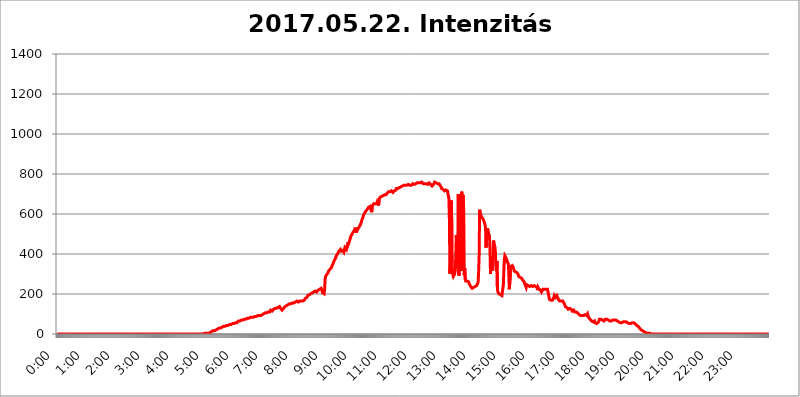
| Category | 2017.05.22. Intenzitás [W/m^2] |
|---|---|
| 0.0 | 0 |
| 0.0006944444444444445 | 0 |
| 0.001388888888888889 | 0 |
| 0.0020833333333333333 | 0 |
| 0.002777777777777778 | 0 |
| 0.003472222222222222 | 0 |
| 0.004166666666666667 | 0 |
| 0.004861111111111111 | 0 |
| 0.005555555555555556 | 0 |
| 0.0062499999999999995 | 0 |
| 0.006944444444444444 | 0 |
| 0.007638888888888889 | 0 |
| 0.008333333333333333 | 0 |
| 0.009027777777777779 | 0 |
| 0.009722222222222222 | 0 |
| 0.010416666666666666 | 0 |
| 0.011111111111111112 | 0 |
| 0.011805555555555555 | 0 |
| 0.012499999999999999 | 0 |
| 0.013194444444444444 | 0 |
| 0.013888888888888888 | 0 |
| 0.014583333333333332 | 0 |
| 0.015277777777777777 | 0 |
| 0.015972222222222224 | 0 |
| 0.016666666666666666 | 0 |
| 0.017361111111111112 | 0 |
| 0.018055555555555557 | 0 |
| 0.01875 | 0 |
| 0.019444444444444445 | 0 |
| 0.02013888888888889 | 0 |
| 0.020833333333333332 | 0 |
| 0.02152777777777778 | 0 |
| 0.022222222222222223 | 0 |
| 0.02291666666666667 | 0 |
| 0.02361111111111111 | 0 |
| 0.024305555555555556 | 0 |
| 0.024999999999999998 | 0 |
| 0.025694444444444447 | 0 |
| 0.02638888888888889 | 0 |
| 0.027083333333333334 | 0 |
| 0.027777777777777776 | 0 |
| 0.02847222222222222 | 0 |
| 0.029166666666666664 | 0 |
| 0.029861111111111113 | 0 |
| 0.030555555555555555 | 0 |
| 0.03125 | 0 |
| 0.03194444444444445 | 0 |
| 0.03263888888888889 | 0 |
| 0.03333333333333333 | 0 |
| 0.034027777777777775 | 0 |
| 0.034722222222222224 | 0 |
| 0.035416666666666666 | 0 |
| 0.036111111111111115 | 0 |
| 0.03680555555555556 | 0 |
| 0.0375 | 0 |
| 0.03819444444444444 | 0 |
| 0.03888888888888889 | 0 |
| 0.03958333333333333 | 0 |
| 0.04027777777777778 | 0 |
| 0.04097222222222222 | 0 |
| 0.041666666666666664 | 0 |
| 0.042361111111111106 | 0 |
| 0.04305555555555556 | 0 |
| 0.043750000000000004 | 0 |
| 0.044444444444444446 | 0 |
| 0.04513888888888889 | 0 |
| 0.04583333333333334 | 0 |
| 0.04652777777777778 | 0 |
| 0.04722222222222222 | 0 |
| 0.04791666666666666 | 0 |
| 0.04861111111111111 | 0 |
| 0.049305555555555554 | 0 |
| 0.049999999999999996 | 0 |
| 0.05069444444444445 | 0 |
| 0.051388888888888894 | 0 |
| 0.052083333333333336 | 0 |
| 0.05277777777777778 | 0 |
| 0.05347222222222222 | 0 |
| 0.05416666666666667 | 0 |
| 0.05486111111111111 | 0 |
| 0.05555555555555555 | 0 |
| 0.05625 | 0 |
| 0.05694444444444444 | 0 |
| 0.057638888888888885 | 0 |
| 0.05833333333333333 | 0 |
| 0.05902777777777778 | 0 |
| 0.059722222222222225 | 0 |
| 0.06041666666666667 | 0 |
| 0.061111111111111116 | 0 |
| 0.06180555555555556 | 0 |
| 0.0625 | 0 |
| 0.06319444444444444 | 0 |
| 0.06388888888888888 | 0 |
| 0.06458333333333334 | 0 |
| 0.06527777777777778 | 0 |
| 0.06597222222222222 | 0 |
| 0.06666666666666667 | 0 |
| 0.06736111111111111 | 0 |
| 0.06805555555555555 | 0 |
| 0.06874999999999999 | 0 |
| 0.06944444444444443 | 0 |
| 0.07013888888888889 | 0 |
| 0.07083333333333333 | 0 |
| 0.07152777777777779 | 0 |
| 0.07222222222222223 | 0 |
| 0.07291666666666667 | 0 |
| 0.07361111111111111 | 0 |
| 0.07430555555555556 | 0 |
| 0.075 | 0 |
| 0.07569444444444444 | 0 |
| 0.0763888888888889 | 0 |
| 0.07708333333333334 | 0 |
| 0.07777777777777778 | 0 |
| 0.07847222222222222 | 0 |
| 0.07916666666666666 | 0 |
| 0.0798611111111111 | 0 |
| 0.08055555555555556 | 0 |
| 0.08125 | 0 |
| 0.08194444444444444 | 0 |
| 0.08263888888888889 | 0 |
| 0.08333333333333333 | 0 |
| 0.08402777777777777 | 0 |
| 0.08472222222222221 | 0 |
| 0.08541666666666665 | 0 |
| 0.08611111111111112 | 0 |
| 0.08680555555555557 | 0 |
| 0.08750000000000001 | 0 |
| 0.08819444444444445 | 0 |
| 0.08888888888888889 | 0 |
| 0.08958333333333333 | 0 |
| 0.09027777777777778 | 0 |
| 0.09097222222222222 | 0 |
| 0.09166666666666667 | 0 |
| 0.09236111111111112 | 0 |
| 0.09305555555555556 | 0 |
| 0.09375 | 0 |
| 0.09444444444444444 | 0 |
| 0.09513888888888888 | 0 |
| 0.09583333333333333 | 0 |
| 0.09652777777777777 | 0 |
| 0.09722222222222222 | 0 |
| 0.09791666666666667 | 0 |
| 0.09861111111111111 | 0 |
| 0.09930555555555555 | 0 |
| 0.09999999999999999 | 0 |
| 0.10069444444444443 | 0 |
| 0.1013888888888889 | 0 |
| 0.10208333333333335 | 0 |
| 0.10277777777777779 | 0 |
| 0.10347222222222223 | 0 |
| 0.10416666666666667 | 0 |
| 0.10486111111111111 | 0 |
| 0.10555555555555556 | 0 |
| 0.10625 | 0 |
| 0.10694444444444444 | 0 |
| 0.1076388888888889 | 0 |
| 0.10833333333333334 | 0 |
| 0.10902777777777778 | 0 |
| 0.10972222222222222 | 0 |
| 0.1111111111111111 | 0 |
| 0.11180555555555556 | 0 |
| 0.11180555555555556 | 0 |
| 0.1125 | 0 |
| 0.11319444444444444 | 0 |
| 0.11388888888888889 | 0 |
| 0.11458333333333333 | 0 |
| 0.11527777777777777 | 0 |
| 0.11597222222222221 | 0 |
| 0.11666666666666665 | 0 |
| 0.1173611111111111 | 0 |
| 0.11805555555555557 | 0 |
| 0.11944444444444445 | 0 |
| 0.12013888888888889 | 0 |
| 0.12083333333333333 | 0 |
| 0.12152777777777778 | 0 |
| 0.12222222222222223 | 0 |
| 0.12291666666666667 | 0 |
| 0.12291666666666667 | 0 |
| 0.12361111111111112 | 0 |
| 0.12430555555555556 | 0 |
| 0.125 | 0 |
| 0.12569444444444444 | 0 |
| 0.12638888888888888 | 0 |
| 0.12708333333333333 | 0 |
| 0.16875 | 0 |
| 0.12847222222222224 | 0 |
| 0.12916666666666668 | 0 |
| 0.12986111111111112 | 0 |
| 0.13055555555555556 | 0 |
| 0.13125 | 0 |
| 0.13194444444444445 | 0 |
| 0.1326388888888889 | 0 |
| 0.13333333333333333 | 0 |
| 0.13402777777777777 | 0 |
| 0.13402777777777777 | 0 |
| 0.13472222222222222 | 0 |
| 0.13541666666666666 | 0 |
| 0.1361111111111111 | 0 |
| 0.13749999999999998 | 0 |
| 0.13819444444444443 | 0 |
| 0.1388888888888889 | 0 |
| 0.13958333333333334 | 0 |
| 0.14027777777777778 | 0 |
| 0.14097222222222222 | 0 |
| 0.14166666666666666 | 0 |
| 0.1423611111111111 | 0 |
| 0.14305555555555557 | 0 |
| 0.14375000000000002 | 0 |
| 0.14444444444444446 | 0 |
| 0.1451388888888889 | 0 |
| 0.1451388888888889 | 0 |
| 0.14652777777777778 | 0 |
| 0.14722222222222223 | 0 |
| 0.14791666666666667 | 0 |
| 0.1486111111111111 | 0 |
| 0.14930555555555555 | 0 |
| 0.15 | 0 |
| 0.15069444444444444 | 0 |
| 0.15138888888888888 | 0 |
| 0.15208333333333332 | 0 |
| 0.15277777777777776 | 0 |
| 0.15347222222222223 | 0 |
| 0.15416666666666667 | 0 |
| 0.15486111111111112 | 0 |
| 0.15555555555555556 | 0 |
| 0.15625 | 0 |
| 0.15694444444444444 | 0 |
| 0.15763888888888888 | 0 |
| 0.15833333333333333 | 0 |
| 0.15902777777777777 | 0 |
| 0.15972222222222224 | 0 |
| 0.16041666666666668 | 0 |
| 0.16111111111111112 | 0 |
| 0.16180555555555556 | 0 |
| 0.1625 | 0 |
| 0.16319444444444445 | 0 |
| 0.1638888888888889 | 0 |
| 0.16458333333333333 | 0 |
| 0.16527777777777777 | 0 |
| 0.16597222222222222 | 0 |
| 0.16666666666666666 | 0 |
| 0.1673611111111111 | 0 |
| 0.16805555555555554 | 0 |
| 0.16874999999999998 | 0 |
| 0.16944444444444443 | 0 |
| 0.17013888888888887 | 0 |
| 0.1708333333333333 | 0 |
| 0.17152777777777775 | 0 |
| 0.17222222222222225 | 0 |
| 0.1729166666666667 | 0 |
| 0.17361111111111113 | 0 |
| 0.17430555555555557 | 0 |
| 0.17500000000000002 | 0 |
| 0.17569444444444446 | 0 |
| 0.1763888888888889 | 0 |
| 0.17708333333333334 | 0 |
| 0.17777777777777778 | 0 |
| 0.17847222222222223 | 0 |
| 0.17916666666666667 | 0 |
| 0.1798611111111111 | 0 |
| 0.18055555555555555 | 0 |
| 0.18125 | 0 |
| 0.18194444444444444 | 0 |
| 0.1826388888888889 | 0 |
| 0.18333333333333335 | 0 |
| 0.1840277777777778 | 0 |
| 0.18472222222222223 | 0 |
| 0.18541666666666667 | 0 |
| 0.18611111111111112 | 0 |
| 0.18680555555555556 | 0 |
| 0.1875 | 0 |
| 0.18819444444444444 | 0 |
| 0.18888888888888888 | 0 |
| 0.18958333333333333 | 0 |
| 0.19027777777777777 | 0 |
| 0.1909722222222222 | 0 |
| 0.19166666666666665 | 0 |
| 0.19236111111111112 | 0 |
| 0.19305555555555554 | 0 |
| 0.19375 | 0 |
| 0.19444444444444445 | 0 |
| 0.1951388888888889 | 0 |
| 0.19583333333333333 | 0 |
| 0.19652777777777777 | 0 |
| 0.19722222222222222 | 0 |
| 0.19791666666666666 | 0 |
| 0.1986111111111111 | 0 |
| 0.19930555555555554 | 0 |
| 0.19999999999999998 | 0 |
| 0.20069444444444443 | 0 |
| 0.20138888888888887 | 0 |
| 0.2020833333333333 | 0 |
| 0.2027777777777778 | 0 |
| 0.2034722222222222 | 0 |
| 0.2041666666666667 | 0 |
| 0.20486111111111113 | 0 |
| 0.20555555555555557 | 3.525 |
| 0.20625000000000002 | 3.525 |
| 0.20694444444444446 | 3.525 |
| 0.2076388888888889 | 3.525 |
| 0.20833333333333334 | 3.525 |
| 0.20902777777777778 | 3.525 |
| 0.20972222222222223 | 3.525 |
| 0.21041666666666667 | 3.525 |
| 0.2111111111111111 | 3.525 |
| 0.21180555555555555 | 3.525 |
| 0.2125 | 3.525 |
| 0.21319444444444444 | 3.525 |
| 0.2138888888888889 | 7.887 |
| 0.21458333333333335 | 7.887 |
| 0.2152777777777778 | 7.887 |
| 0.21597222222222223 | 12.257 |
| 0.21666666666666667 | 12.257 |
| 0.21736111111111112 | 12.257 |
| 0.21805555555555556 | 16.636 |
| 0.21875 | 16.636 |
| 0.21944444444444444 | 16.636 |
| 0.22013888888888888 | 16.636 |
| 0.22083333333333333 | 16.636 |
| 0.22152777777777777 | 16.636 |
| 0.2222222222222222 | 16.636 |
| 0.22291666666666665 | 21.024 |
| 0.2236111111111111 | 21.024 |
| 0.22430555555555556 | 21.024 |
| 0.225 | 25.419 |
| 0.22569444444444445 | 25.419 |
| 0.2263888888888889 | 25.419 |
| 0.22708333333333333 | 29.823 |
| 0.22777777777777777 | 29.823 |
| 0.22847222222222222 | 29.823 |
| 0.22916666666666666 | 29.823 |
| 0.2298611111111111 | 29.823 |
| 0.23055555555555554 | 34.234 |
| 0.23124999999999998 | 34.234 |
| 0.23194444444444443 | 34.234 |
| 0.23263888888888887 | 38.653 |
| 0.2333333333333333 | 38.653 |
| 0.2340277777777778 | 38.653 |
| 0.2347222222222222 | 38.653 |
| 0.2354166666666667 | 38.653 |
| 0.23611111111111113 | 38.653 |
| 0.23680555555555557 | 43.079 |
| 0.23750000000000002 | 43.079 |
| 0.23819444444444446 | 43.079 |
| 0.2388888888888889 | 43.079 |
| 0.23958333333333334 | 43.079 |
| 0.24027777777777778 | 47.511 |
| 0.24097222222222223 | 47.511 |
| 0.24166666666666667 | 47.511 |
| 0.2423611111111111 | 47.511 |
| 0.24305555555555555 | 47.511 |
| 0.24375 | 47.511 |
| 0.24444444444444446 | 47.511 |
| 0.24513888888888888 | 47.511 |
| 0.24583333333333335 | 51.951 |
| 0.2465277777777778 | 51.951 |
| 0.24722222222222223 | 51.951 |
| 0.24791666666666667 | 51.951 |
| 0.24861111111111112 | 56.398 |
| 0.24930555555555556 | 56.398 |
| 0.25 | 56.398 |
| 0.25069444444444444 | 56.398 |
| 0.2513888888888889 | 56.398 |
| 0.2520833333333333 | 56.398 |
| 0.25277777777777777 | 60.85 |
| 0.2534722222222222 | 60.85 |
| 0.25416666666666665 | 65.31 |
| 0.2548611111111111 | 65.31 |
| 0.2555555555555556 | 65.31 |
| 0.25625000000000003 | 65.31 |
| 0.2569444444444445 | 65.31 |
| 0.2576388888888889 | 65.31 |
| 0.25833333333333336 | 69.775 |
| 0.2590277777777778 | 69.775 |
| 0.25972222222222224 | 69.775 |
| 0.2604166666666667 | 69.775 |
| 0.2611111111111111 | 69.775 |
| 0.26180555555555557 | 69.775 |
| 0.2625 | 74.246 |
| 0.26319444444444445 | 74.246 |
| 0.2638888888888889 | 74.246 |
| 0.26458333333333334 | 74.246 |
| 0.2652777777777778 | 78.722 |
| 0.2659722222222222 | 78.722 |
| 0.26666666666666666 | 78.722 |
| 0.2673611111111111 | 78.722 |
| 0.26805555555555555 | 78.722 |
| 0.26875 | 78.722 |
| 0.26944444444444443 | 83.205 |
| 0.2701388888888889 | 83.205 |
| 0.2708333333333333 | 83.205 |
| 0.27152777777777776 | 83.205 |
| 0.2722222222222222 | 83.205 |
| 0.27291666666666664 | 83.205 |
| 0.2736111111111111 | 83.205 |
| 0.2743055555555555 | 83.205 |
| 0.27499999999999997 | 83.205 |
| 0.27569444444444446 | 87.692 |
| 0.27638888888888885 | 87.692 |
| 0.27708333333333335 | 87.692 |
| 0.2777777777777778 | 87.692 |
| 0.27847222222222223 | 92.184 |
| 0.2791666666666667 | 87.692 |
| 0.2798611111111111 | 92.184 |
| 0.28055555555555556 | 92.184 |
| 0.28125 | 92.184 |
| 0.28194444444444444 | 92.184 |
| 0.2826388888888889 | 92.184 |
| 0.2833333333333333 | 92.184 |
| 0.28402777777777777 | 92.184 |
| 0.2847222222222222 | 92.184 |
| 0.28541666666666665 | 92.184 |
| 0.28611111111111115 | 96.682 |
| 0.28680555555555554 | 96.682 |
| 0.28750000000000003 | 96.682 |
| 0.2881944444444445 | 101.184 |
| 0.2888888888888889 | 101.184 |
| 0.28958333333333336 | 101.184 |
| 0.2902777777777778 | 105.69 |
| 0.29097222222222224 | 105.69 |
| 0.2916666666666667 | 105.69 |
| 0.2923611111111111 | 105.69 |
| 0.29305555555555557 | 105.69 |
| 0.29375 | 105.69 |
| 0.29444444444444445 | 105.69 |
| 0.2951388888888889 | 110.201 |
| 0.29583333333333334 | 110.201 |
| 0.2965277777777778 | 110.201 |
| 0.2972222222222222 | 114.716 |
| 0.29791666666666666 | 110.201 |
| 0.2986111111111111 | 114.716 |
| 0.29930555555555555 | 119.235 |
| 0.3 | 119.235 |
| 0.30069444444444443 | 114.716 |
| 0.3013888888888889 | 114.716 |
| 0.3020833333333333 | 119.235 |
| 0.30277777777777776 | 119.235 |
| 0.3034722222222222 | 123.758 |
| 0.30416666666666664 | 123.758 |
| 0.3048611111111111 | 128.284 |
| 0.3055555555555555 | 128.284 |
| 0.30624999999999997 | 128.284 |
| 0.3069444444444444 | 128.284 |
| 0.3076388888888889 | 128.284 |
| 0.30833333333333335 | 128.284 |
| 0.3090277777777778 | 132.814 |
| 0.30972222222222223 | 132.814 |
| 0.3104166666666667 | 132.814 |
| 0.3111111111111111 | 132.814 |
| 0.31180555555555556 | 137.347 |
| 0.3125 | 132.814 |
| 0.31319444444444444 | 128.284 |
| 0.3138888888888889 | 128.284 |
| 0.3145833333333333 | 128.284 |
| 0.31527777777777777 | 119.235 |
| 0.3159722222222222 | 123.758 |
| 0.31666666666666665 | 123.758 |
| 0.31736111111111115 | 128.284 |
| 0.31805555555555554 | 128.284 |
| 0.31875000000000003 | 132.814 |
| 0.3194444444444445 | 137.347 |
| 0.3201388888888889 | 137.347 |
| 0.32083333333333336 | 137.347 |
| 0.3215277777777778 | 141.884 |
| 0.32222222222222224 | 141.884 |
| 0.3229166666666667 | 141.884 |
| 0.3236111111111111 | 146.423 |
| 0.32430555555555557 | 146.423 |
| 0.325 | 150.964 |
| 0.32569444444444445 | 150.964 |
| 0.3263888888888889 | 146.423 |
| 0.32708333333333334 | 150.964 |
| 0.3277777777777778 | 150.964 |
| 0.3284722222222222 | 150.964 |
| 0.32916666666666666 | 155.509 |
| 0.3298611111111111 | 155.509 |
| 0.33055555555555555 | 155.509 |
| 0.33125 | 155.509 |
| 0.33194444444444443 | 155.509 |
| 0.3326388888888889 | 160.056 |
| 0.3333333333333333 | 155.509 |
| 0.3340277777777778 | 160.056 |
| 0.3347222222222222 | 160.056 |
| 0.3354166666666667 | 164.605 |
| 0.3361111111111111 | 164.605 |
| 0.3368055555555556 | 164.605 |
| 0.33749999999999997 | 164.605 |
| 0.33819444444444446 | 160.056 |
| 0.33888888888888885 | 164.605 |
| 0.33958333333333335 | 164.605 |
| 0.34027777777777773 | 164.605 |
| 0.34097222222222223 | 164.605 |
| 0.3416666666666666 | 164.605 |
| 0.3423611111111111 | 164.605 |
| 0.3430555555555555 | 164.605 |
| 0.34375 | 164.605 |
| 0.3444444444444445 | 164.605 |
| 0.3451388888888889 | 164.605 |
| 0.3458333333333334 | 164.605 |
| 0.34652777777777777 | 169.156 |
| 0.34722222222222227 | 173.709 |
| 0.34791666666666665 | 178.264 |
| 0.34861111111111115 | 178.264 |
| 0.34930555555555554 | 182.82 |
| 0.35000000000000003 | 182.82 |
| 0.3506944444444444 | 187.378 |
| 0.3513888888888889 | 191.937 |
| 0.3520833333333333 | 196.497 |
| 0.3527777777777778 | 196.497 |
| 0.3534722222222222 | 196.497 |
| 0.3541666666666667 | 201.058 |
| 0.3548611111111111 | 201.058 |
| 0.35555555555555557 | 201.058 |
| 0.35625 | 205.62 |
| 0.35694444444444445 | 205.62 |
| 0.3576388888888889 | 205.62 |
| 0.35833333333333334 | 210.182 |
| 0.3590277777777778 | 210.182 |
| 0.3597222222222222 | 210.182 |
| 0.36041666666666666 | 210.182 |
| 0.3611111111111111 | 210.182 |
| 0.36180555555555555 | 214.746 |
| 0.3625 | 210.182 |
| 0.36319444444444443 | 210.182 |
| 0.3638888888888889 | 210.182 |
| 0.3645833333333333 | 210.182 |
| 0.3652777777777778 | 214.746 |
| 0.3659722222222222 | 219.309 |
| 0.3666666666666667 | 219.309 |
| 0.3673611111111111 | 219.309 |
| 0.3680555555555556 | 223.873 |
| 0.36874999999999997 | 223.873 |
| 0.36944444444444446 | 228.436 |
| 0.37013888888888885 | 228.436 |
| 0.37083333333333335 | 223.873 |
| 0.37152777777777773 | 214.746 |
| 0.37222222222222223 | 205.62 |
| 0.3729166666666666 | 205.62 |
| 0.3736111111111111 | 201.058 |
| 0.3743055555555555 | 201.058 |
| 0.375 | 223.873 |
| 0.3756944444444445 | 274.047 |
| 0.3763888888888889 | 287.709 |
| 0.3770833333333334 | 292.259 |
| 0.37777777777777777 | 296.808 |
| 0.37847222222222227 | 296.808 |
| 0.37916666666666665 | 301.354 |
| 0.37986111111111115 | 305.898 |
| 0.38055555555555554 | 314.98 |
| 0.38125000000000003 | 314.98 |
| 0.3819444444444444 | 319.517 |
| 0.3826388888888889 | 324.052 |
| 0.3833333333333333 | 328.584 |
| 0.3840277777777778 | 328.584 |
| 0.3847222222222222 | 333.113 |
| 0.3854166666666667 | 342.162 |
| 0.3861111111111111 | 346.682 |
| 0.38680555555555557 | 351.198 |
| 0.3875 | 355.712 |
| 0.38819444444444445 | 364.728 |
| 0.3888888888888889 | 369.23 |
| 0.38958333333333334 | 373.729 |
| 0.3902777777777778 | 378.224 |
| 0.3909722222222222 | 387.202 |
| 0.39166666666666666 | 391.685 |
| 0.3923611111111111 | 396.164 |
| 0.39305555555555555 | 400.638 |
| 0.39375 | 405.108 |
| 0.39444444444444443 | 409.574 |
| 0.3951388888888889 | 414.035 |
| 0.3958333333333333 | 414.035 |
| 0.3965277777777778 | 418.492 |
| 0.3972222222222222 | 422.943 |
| 0.3979166666666667 | 422.943 |
| 0.3986111111111111 | 414.035 |
| 0.3993055555555556 | 414.035 |
| 0.39999999999999997 | 414.035 |
| 0.40069444444444446 | 418.492 |
| 0.40138888888888885 | 418.492 |
| 0.40208333333333335 | 409.574 |
| 0.40277777777777773 | 418.492 |
| 0.40347222222222223 | 431.833 |
| 0.4041666666666666 | 431.833 |
| 0.4048611111111111 | 427.39 |
| 0.4055555555555555 | 422.943 |
| 0.40625 | 436.27 |
| 0.4069444444444445 | 445.129 |
| 0.4076388888888889 | 458.38 |
| 0.4083333333333334 | 449.551 |
| 0.40902777777777777 | 445.129 |
| 0.40972222222222227 | 462.786 |
| 0.41041666666666665 | 471.582 |
| 0.41111111111111115 | 480.356 |
| 0.41180555555555554 | 489.108 |
| 0.41250000000000003 | 493.475 |
| 0.4131944444444444 | 497.836 |
| 0.4138888888888889 | 502.192 |
| 0.4145833333333333 | 506.542 |
| 0.4152777777777778 | 510.885 |
| 0.4159722222222222 | 515.223 |
| 0.4166666666666667 | 519.555 |
| 0.4173611111111111 | 523.88 |
| 0.41805555555555557 | 532.513 |
| 0.41875 | 532.513 |
| 0.41944444444444445 | 506.542 |
| 0.4201388888888889 | 515.223 |
| 0.42083333333333334 | 519.555 |
| 0.4215277777777778 | 523.88 |
| 0.4222222222222222 | 528.2 |
| 0.42291666666666666 | 532.513 |
| 0.4236111111111111 | 536.82 |
| 0.42430555555555555 | 536.82 |
| 0.425 | 545.416 |
| 0.42569444444444443 | 549.704 |
| 0.4263888888888889 | 558.261 |
| 0.4270833333333333 | 566.793 |
| 0.4277777777777778 | 575.299 |
| 0.4284722222222222 | 579.542 |
| 0.4291666666666667 | 588.009 |
| 0.4298611111111111 | 596.45 |
| 0.4305555555555556 | 600.661 |
| 0.43124999999999997 | 604.864 |
| 0.43194444444444446 | 609.062 |
| 0.43263888888888885 | 609.062 |
| 0.43333333333333335 | 617.436 |
| 0.43402777777777773 | 621.613 |
| 0.43472222222222223 | 621.613 |
| 0.4354166666666666 | 625.784 |
| 0.4361111111111111 | 625.784 |
| 0.4368055555555555 | 634.105 |
| 0.4375 | 634.105 |
| 0.4381944444444445 | 634.105 |
| 0.4388888888888889 | 638.256 |
| 0.4395833333333334 | 634.105 |
| 0.44027777777777777 | 617.436 |
| 0.44097222222222227 | 609.062 |
| 0.44166666666666665 | 634.105 |
| 0.44236111111111115 | 642.4 |
| 0.44305555555555554 | 646.537 |
| 0.44375000000000003 | 650.667 |
| 0.4444444444444444 | 646.537 |
| 0.4451388888888889 | 646.537 |
| 0.4458333333333333 | 650.667 |
| 0.4465277777777778 | 650.667 |
| 0.4472222222222222 | 650.667 |
| 0.4479166666666667 | 650.667 |
| 0.4486111111111111 | 658.909 |
| 0.44930555555555557 | 658.909 |
| 0.45 | 663.019 |
| 0.45069444444444445 | 642.4 |
| 0.4513888888888889 | 675.311 |
| 0.45208333333333334 | 679.395 |
| 0.4527777777777778 | 683.473 |
| 0.4534722222222222 | 683.473 |
| 0.45416666666666666 | 687.544 |
| 0.4548611111111111 | 687.544 |
| 0.45555555555555555 | 687.544 |
| 0.45625 | 687.544 |
| 0.45694444444444443 | 691.608 |
| 0.4576388888888889 | 691.608 |
| 0.4583333333333333 | 691.608 |
| 0.4590277777777778 | 695.666 |
| 0.4597222222222222 | 691.608 |
| 0.4604166666666667 | 691.608 |
| 0.4611111111111111 | 695.666 |
| 0.4618055555555556 | 699.717 |
| 0.46249999999999997 | 703.762 |
| 0.46319444444444446 | 703.762 |
| 0.46388888888888885 | 707.8 |
| 0.46458333333333335 | 711.832 |
| 0.46527777777777773 | 707.8 |
| 0.46597222222222223 | 711.832 |
| 0.4666666666666666 | 711.832 |
| 0.4673611111111111 | 715.858 |
| 0.4680555555555555 | 711.832 |
| 0.46875 | 715.858 |
| 0.4694444444444445 | 715.858 |
| 0.4701388888888889 | 711.832 |
| 0.4708333333333334 | 707.8 |
| 0.47152777777777777 | 711.832 |
| 0.47222222222222227 | 707.8 |
| 0.47291666666666665 | 715.858 |
| 0.47361111111111115 | 711.832 |
| 0.47430555555555554 | 719.877 |
| 0.47500000000000003 | 719.877 |
| 0.4756944444444444 | 727.896 |
| 0.4763888888888889 | 727.896 |
| 0.4770833333333333 | 727.896 |
| 0.4777777777777778 | 727.896 |
| 0.4784722222222222 | 731.896 |
| 0.4791666666666667 | 727.896 |
| 0.4798611111111111 | 731.896 |
| 0.48055555555555557 | 727.896 |
| 0.48125 | 731.896 |
| 0.48194444444444445 | 735.89 |
| 0.4826388888888889 | 739.877 |
| 0.48333333333333334 | 735.89 |
| 0.4840277777777778 | 739.877 |
| 0.4847222222222222 | 739.877 |
| 0.48541666666666666 | 739.877 |
| 0.4861111111111111 | 743.859 |
| 0.48680555555555555 | 743.859 |
| 0.4875 | 743.859 |
| 0.48819444444444443 | 743.859 |
| 0.4888888888888889 | 743.859 |
| 0.4895833333333333 | 743.859 |
| 0.4902777777777778 | 743.859 |
| 0.4909722222222222 | 743.859 |
| 0.4916666666666667 | 743.859 |
| 0.4923611111111111 | 747.834 |
| 0.4930555555555556 | 747.834 |
| 0.49374999999999997 | 743.859 |
| 0.49444444444444446 | 743.859 |
| 0.49513888888888885 | 743.859 |
| 0.49583333333333335 | 743.859 |
| 0.49652777777777773 | 743.859 |
| 0.49722222222222223 | 743.859 |
| 0.4979166666666666 | 747.834 |
| 0.4986111111111111 | 751.803 |
| 0.4993055555555555 | 751.803 |
| 0.5 | 751.803 |
| 0.5006944444444444 | 747.834 |
| 0.5013888888888889 | 747.834 |
| 0.5020833333333333 | 751.803 |
| 0.5027777777777778 | 751.803 |
| 0.5034722222222222 | 755.766 |
| 0.5041666666666667 | 755.766 |
| 0.5048611111111111 | 755.766 |
| 0.5055555555555555 | 759.723 |
| 0.50625 | 755.766 |
| 0.5069444444444444 | 755.766 |
| 0.5076388888888889 | 755.766 |
| 0.5083333333333333 | 759.723 |
| 0.5090277777777777 | 755.766 |
| 0.5097222222222222 | 759.723 |
| 0.5104166666666666 | 759.723 |
| 0.5111111111111112 | 759.723 |
| 0.5118055555555555 | 759.723 |
| 0.5125000000000001 | 759.723 |
| 0.5131944444444444 | 751.803 |
| 0.513888888888889 | 747.834 |
| 0.5145833333333333 | 751.803 |
| 0.5152777777777778 | 751.803 |
| 0.5159722222222222 | 755.766 |
| 0.5166666666666667 | 751.803 |
| 0.517361111111111 | 751.803 |
| 0.5180555555555556 | 751.803 |
| 0.5187499999999999 | 747.834 |
| 0.5194444444444445 | 747.834 |
| 0.5201388888888888 | 751.803 |
| 0.5208333333333334 | 751.803 |
| 0.5215277777777778 | 755.766 |
| 0.5222222222222223 | 751.803 |
| 0.5229166666666667 | 751.803 |
| 0.5236111111111111 | 747.834 |
| 0.5243055555555556 | 743.859 |
| 0.525 | 743.859 |
| 0.5256944444444445 | 739.877 |
| 0.5263888888888889 | 739.877 |
| 0.5270833333333333 | 743.859 |
| 0.5277777777777778 | 747.834 |
| 0.5284722222222222 | 751.803 |
| 0.5291666666666667 | 759.723 |
| 0.5298611111111111 | 755.766 |
| 0.5305555555555556 | 759.723 |
| 0.53125 | 755.766 |
| 0.5319444444444444 | 755.766 |
| 0.5326388888888889 | 751.803 |
| 0.5333333333333333 | 751.803 |
| 0.5340277777777778 | 747.834 |
| 0.5347222222222222 | 747.834 |
| 0.5354166666666667 | 751.803 |
| 0.5361111111111111 | 751.803 |
| 0.5368055555555555 | 743.859 |
| 0.5375 | 739.877 |
| 0.5381944444444444 | 735.89 |
| 0.5388888888888889 | 727.896 |
| 0.5395833333333333 | 723.889 |
| 0.5402777777777777 | 727.896 |
| 0.5409722222222222 | 723.889 |
| 0.5416666666666666 | 723.889 |
| 0.5423611111111112 | 719.877 |
| 0.5430555555555555 | 715.858 |
| 0.5437500000000001 | 711.832 |
| 0.5444444444444444 | 711.832 |
| 0.545138888888889 | 719.877 |
| 0.5458333333333333 | 723.889 |
| 0.5465277777777778 | 719.877 |
| 0.5472222222222222 | 715.858 |
| 0.5479166666666667 | 715.858 |
| 0.548611111111111 | 711.832 |
| 0.5493055555555556 | 675.311 |
| 0.5499999999999999 | 575.299 |
| 0.5506944444444445 | 301.354 |
| 0.5513888888888888 | 342.162 |
| 0.5520833333333334 | 405.108 |
| 0.5527777777777778 | 667.123 |
| 0.5534722222222223 | 489.108 |
| 0.5541666666666667 | 314.98 |
| 0.5548611111111111 | 296.808 |
| 0.5555555555555556 | 287.709 |
| 0.55625 | 287.709 |
| 0.5569444444444445 | 296.808 |
| 0.5576388888888889 | 305.898 |
| 0.5583333333333333 | 319.517 |
| 0.5590277777777778 | 324.052 |
| 0.5597222222222222 | 493.475 |
| 0.5604166666666667 | 396.164 |
| 0.5611111111111111 | 355.712 |
| 0.5618055555555556 | 422.943 |
| 0.5625 | 699.717 |
| 0.5631944444444444 | 292.259 |
| 0.5638888888888889 | 301.354 |
| 0.5645833333333333 | 382.715 |
| 0.5652777777777778 | 592.233 |
| 0.5659722222222222 | 553.986 |
| 0.5666666666666667 | 667.123 |
| 0.5673611111111111 | 711.832 |
| 0.5680555555555555 | 314.98 |
| 0.56875 | 695.666 |
| 0.5694444444444444 | 687.544 |
| 0.5701388888888889 | 609.062 |
| 0.5708333333333333 | 296.808 |
| 0.5715277777777777 | 328.584 |
| 0.5722222222222222 | 274.047 |
| 0.5729166666666666 | 264.932 |
| 0.5736111111111112 | 264.932 |
| 0.5743055555555555 | 264.932 |
| 0.5750000000000001 | 264.932 |
| 0.5756944444444444 | 260.373 |
| 0.576388888888889 | 260.373 |
| 0.5770833333333333 | 260.373 |
| 0.5777777777777778 | 251.251 |
| 0.5784722222222222 | 251.251 |
| 0.5791666666666667 | 246.689 |
| 0.579861111111111 | 237.564 |
| 0.5805555555555556 | 233 |
| 0.5812499999999999 | 233 |
| 0.5819444444444445 | 228.436 |
| 0.5826388888888888 | 233 |
| 0.5833333333333334 | 233 |
| 0.5840277777777778 | 233 |
| 0.5847222222222223 | 233 |
| 0.5854166666666667 | 233 |
| 0.5861111111111111 | 237.564 |
| 0.5868055555555556 | 242.127 |
| 0.5875 | 242.127 |
| 0.5881944444444445 | 242.127 |
| 0.5888888888888889 | 246.689 |
| 0.5895833333333333 | 251.251 |
| 0.5902777777777778 | 260.373 |
| 0.5909722222222222 | 310.44 |
| 0.5916666666666667 | 382.715 |
| 0.5923611111111111 | 621.613 |
| 0.5930555555555556 | 609.062 |
| 0.59375 | 600.661 |
| 0.5944444444444444 | 592.233 |
| 0.5951388888888889 | 583.779 |
| 0.5958333333333333 | 579.542 |
| 0.5965277777777778 | 583.779 |
| 0.5972222222222222 | 575.299 |
| 0.5979166666666667 | 571.049 |
| 0.5986111111111111 | 562.53 |
| 0.5993055555555555 | 558.261 |
| 0.6 | 545.416 |
| 0.6006944444444444 | 532.513 |
| 0.6013888888888889 | 431.833 |
| 0.6020833333333333 | 489.108 |
| 0.6027777777777777 | 480.356 |
| 0.6034722222222222 | 528.2 |
| 0.6041666666666666 | 515.223 |
| 0.6048611111111112 | 510.885 |
| 0.6055555555555555 | 510.885 |
| 0.6062500000000001 | 489.108 |
| 0.6069444444444444 | 418.492 |
| 0.607638888888889 | 301.354 |
| 0.6083333333333333 | 364.728 |
| 0.6090277777777778 | 387.202 |
| 0.6097222222222222 | 314.98 |
| 0.6104166666666667 | 310.44 |
| 0.611111111111111 | 387.202 |
| 0.6118055555555556 | 467.187 |
| 0.6124999999999999 | 458.38 |
| 0.6131944444444445 | 445.129 |
| 0.6138888888888888 | 436.27 |
| 0.6145833333333334 | 405.108 |
| 0.6152777777777778 | 328.584 |
| 0.6159722222222223 | 314.98 |
| 0.6166666666666667 | 364.728 |
| 0.6173611111111111 | 223.873 |
| 0.6180555555555556 | 210.182 |
| 0.61875 | 205.62 |
| 0.6194444444444445 | 201.058 |
| 0.6201388888888889 | 201.058 |
| 0.6208333333333333 | 196.497 |
| 0.6215277777777778 | 196.497 |
| 0.6222222222222222 | 191.937 |
| 0.6229166666666667 | 191.937 |
| 0.6236111111111111 | 191.937 |
| 0.6243055555555556 | 191.937 |
| 0.625 | 196.497 |
| 0.6256944444444444 | 246.689 |
| 0.6263888888888889 | 319.517 |
| 0.6270833333333333 | 373.729 |
| 0.6277777777777778 | 391.685 |
| 0.6284722222222222 | 391.685 |
| 0.6291666666666667 | 382.715 |
| 0.6298611111111111 | 378.224 |
| 0.6305555555555555 | 369.23 |
| 0.63125 | 360.221 |
| 0.6319444444444444 | 355.712 |
| 0.6326388888888889 | 351.198 |
| 0.6333333333333333 | 301.354 |
| 0.6340277777777777 | 223.873 |
| 0.6347222222222222 | 219.309 |
| 0.6354166666666666 | 228.436 |
| 0.6361111111111112 | 337.639 |
| 0.6368055555555555 | 342.162 |
| 0.6375000000000001 | 342.162 |
| 0.6381944444444444 | 342.162 |
| 0.638888888888889 | 337.639 |
| 0.6395833333333333 | 333.113 |
| 0.6402777777777778 | 324.052 |
| 0.6409722222222222 | 314.98 |
| 0.6416666666666667 | 310.44 |
| 0.642361111111111 | 310.44 |
| 0.6430555555555556 | 310.44 |
| 0.6437499999999999 | 305.898 |
| 0.6444444444444445 | 305.898 |
| 0.6451388888888888 | 305.898 |
| 0.6458333333333334 | 301.354 |
| 0.6465277777777778 | 296.808 |
| 0.6472222222222223 | 287.709 |
| 0.6479166666666667 | 287.709 |
| 0.6486111111111111 | 283.156 |
| 0.6493055555555556 | 283.156 |
| 0.65 | 283.156 |
| 0.6506944444444445 | 278.603 |
| 0.6513888888888889 | 278.603 |
| 0.6520833333333333 | 274.047 |
| 0.6527777777777778 | 269.49 |
| 0.6534722222222222 | 269.49 |
| 0.6541666666666667 | 264.932 |
| 0.6548611111111111 | 260.373 |
| 0.6555555555555556 | 251.251 |
| 0.65625 | 251.251 |
| 0.6569444444444444 | 251.251 |
| 0.6576388888888889 | 233 |
| 0.6583333333333333 | 246.689 |
| 0.6590277777777778 | 246.689 |
| 0.6597222222222222 | 246.689 |
| 0.6604166666666667 | 242.127 |
| 0.6611111111111111 | 242.127 |
| 0.6618055555555555 | 237.564 |
| 0.6625 | 237.564 |
| 0.6631944444444444 | 237.564 |
| 0.6638888888888889 | 242.127 |
| 0.6645833333333333 | 242.127 |
| 0.6652777777777777 | 242.127 |
| 0.6659722222222222 | 237.564 |
| 0.6666666666666666 | 237.564 |
| 0.6673611111111111 | 237.564 |
| 0.6680555555555556 | 242.127 |
| 0.6687500000000001 | 242.127 |
| 0.6694444444444444 | 237.564 |
| 0.6701388888888888 | 237.564 |
| 0.6708333333333334 | 237.564 |
| 0.6715277777777778 | 237.564 |
| 0.6722222222222222 | 237.564 |
| 0.6729166666666666 | 233 |
| 0.6736111111111112 | 219.309 |
| 0.6743055555555556 | 233 |
| 0.6749999999999999 | 228.436 |
| 0.6756944444444444 | 223.873 |
| 0.6763888888888889 | 219.309 |
| 0.6770833333333334 | 219.309 |
| 0.6777777777777777 | 219.309 |
| 0.6784722222222223 | 214.746 |
| 0.6791666666666667 | 210.182 |
| 0.6798611111111111 | 210.182 |
| 0.6805555555555555 | 214.746 |
| 0.68125 | 223.873 |
| 0.6819444444444445 | 223.873 |
| 0.6826388888888889 | 223.873 |
| 0.6833333333333332 | 223.873 |
| 0.6840277777777778 | 223.873 |
| 0.6847222222222222 | 223.873 |
| 0.6854166666666667 | 223.873 |
| 0.686111111111111 | 223.873 |
| 0.6868055555555556 | 223.873 |
| 0.6875 | 223.873 |
| 0.6881944444444444 | 223.873 |
| 0.688888888888889 | 219.309 |
| 0.6895833333333333 | 187.378 |
| 0.6902777777777778 | 173.709 |
| 0.6909722222222222 | 169.156 |
| 0.6916666666666668 | 169.156 |
| 0.6923611111111111 | 169.156 |
| 0.6930555555555555 | 173.709 |
| 0.69375 | 173.709 |
| 0.6944444444444445 | 169.156 |
| 0.6951388888888889 | 169.156 |
| 0.6958333333333333 | 173.709 |
| 0.6965277777777777 | 182.82 |
| 0.6972222222222223 | 191.937 |
| 0.6979166666666666 | 191.937 |
| 0.6986111111111111 | 182.82 |
| 0.6993055555555556 | 182.82 |
| 0.7000000000000001 | 187.378 |
| 0.7006944444444444 | 191.937 |
| 0.7013888888888888 | 191.937 |
| 0.7020833333333334 | 191.937 |
| 0.7027777777777778 | 173.709 |
| 0.7034722222222222 | 173.709 |
| 0.7041666666666666 | 169.156 |
| 0.7048611111111112 | 164.605 |
| 0.7055555555555556 | 169.156 |
| 0.7062499999999999 | 164.605 |
| 0.7069444444444444 | 164.605 |
| 0.7076388888888889 | 160.056 |
| 0.7083333333333334 | 160.056 |
| 0.7090277777777777 | 164.605 |
| 0.7097222222222223 | 160.056 |
| 0.7104166666666667 | 155.509 |
| 0.7111111111111111 | 155.509 |
| 0.7118055555555555 | 146.423 |
| 0.7125 | 137.347 |
| 0.7131944444444445 | 137.347 |
| 0.7138888888888889 | 137.347 |
| 0.7145833333333332 | 132.814 |
| 0.7152777777777778 | 128.284 |
| 0.7159722222222222 | 128.284 |
| 0.7166666666666667 | 123.758 |
| 0.717361111111111 | 123.758 |
| 0.7180555555555556 | 123.758 |
| 0.71875 | 128.284 |
| 0.7194444444444444 | 128.284 |
| 0.720138888888889 | 128.284 |
| 0.7208333333333333 | 123.758 |
| 0.7215277777777778 | 119.235 |
| 0.7222222222222222 | 114.716 |
| 0.7229166666666668 | 110.201 |
| 0.7236111111111111 | 110.201 |
| 0.7243055555555555 | 119.235 |
| 0.725 | 114.716 |
| 0.7256944444444445 | 110.201 |
| 0.7263888888888889 | 110.201 |
| 0.7270833333333333 | 110.201 |
| 0.7277777777777777 | 110.201 |
| 0.7284722222222223 | 110.201 |
| 0.7291666666666666 | 110.201 |
| 0.7298611111111111 | 105.69 |
| 0.7305555555555556 | 101.184 |
| 0.7312500000000001 | 101.184 |
| 0.7319444444444444 | 96.682 |
| 0.7326388888888888 | 96.682 |
| 0.7333333333333334 | 96.682 |
| 0.7340277777777778 | 92.184 |
| 0.7347222222222222 | 92.184 |
| 0.7354166666666666 | 92.184 |
| 0.7361111111111112 | 92.184 |
| 0.7368055555555556 | 92.184 |
| 0.7374999999999999 | 92.184 |
| 0.7381944444444444 | 92.184 |
| 0.7388888888888889 | 92.184 |
| 0.7395833333333334 | 92.184 |
| 0.7402777777777777 | 96.682 |
| 0.7409722222222223 | 92.184 |
| 0.7416666666666667 | 92.184 |
| 0.7423611111111111 | 92.184 |
| 0.7430555555555555 | 96.682 |
| 0.74375 | 101.184 |
| 0.7444444444444445 | 92.184 |
| 0.7451388888888889 | 83.205 |
| 0.7458333333333332 | 78.722 |
| 0.7465277777777778 | 78.722 |
| 0.7472222222222222 | 74.246 |
| 0.7479166666666667 | 69.775 |
| 0.748611111111111 | 69.775 |
| 0.7493055555555556 | 65.31 |
| 0.75 | 65.31 |
| 0.7506944444444444 | 65.31 |
| 0.751388888888889 | 60.85 |
| 0.7520833333333333 | 65.31 |
| 0.7527777777777778 | 65.31 |
| 0.7534722222222222 | 65.31 |
| 0.7541666666666668 | 56.398 |
| 0.7548611111111111 | 51.951 |
| 0.7555555555555555 | 51.951 |
| 0.75625 | 51.951 |
| 0.7569444444444445 | 51.951 |
| 0.7576388888888889 | 51.951 |
| 0.7583333333333333 | 56.398 |
| 0.7590277777777777 | 60.85 |
| 0.7597222222222223 | 65.31 |
| 0.7604166666666666 | 74.246 |
| 0.7611111111111111 | 74.246 |
| 0.7618055555555556 | 74.246 |
| 0.7625000000000001 | 74.246 |
| 0.7631944444444444 | 74.246 |
| 0.7638888888888888 | 69.775 |
| 0.7645833333333334 | 69.775 |
| 0.7652777777777778 | 65.31 |
| 0.7659722222222222 | 65.31 |
| 0.7666666666666666 | 65.31 |
| 0.7673611111111112 | 65.31 |
| 0.7680555555555556 | 69.775 |
| 0.7687499999999999 | 74.246 |
| 0.7694444444444444 | 74.246 |
| 0.7701388888888889 | 74.246 |
| 0.7708333333333334 | 74.246 |
| 0.7715277777777777 | 74.246 |
| 0.7722222222222223 | 74.246 |
| 0.7729166666666667 | 69.775 |
| 0.7736111111111111 | 69.775 |
| 0.7743055555555555 | 65.31 |
| 0.775 | 65.31 |
| 0.7756944444444445 | 65.31 |
| 0.7763888888888889 | 65.31 |
| 0.7770833333333332 | 65.31 |
| 0.7777777777777778 | 65.31 |
| 0.7784722222222222 | 69.775 |
| 0.7791666666666667 | 69.775 |
| 0.779861111111111 | 69.775 |
| 0.7805555555555556 | 69.775 |
| 0.78125 | 69.775 |
| 0.7819444444444444 | 69.775 |
| 0.782638888888889 | 69.775 |
| 0.7833333333333333 | 69.775 |
| 0.7840277777777778 | 65.31 |
| 0.7847222222222222 | 65.31 |
| 0.7854166666666668 | 65.31 |
| 0.7861111111111111 | 65.31 |
| 0.7868055555555555 | 65.31 |
| 0.7875 | 60.85 |
| 0.7881944444444445 | 60.85 |
| 0.7888888888888889 | 60.85 |
| 0.7895833333333333 | 56.398 |
| 0.7902777777777777 | 56.398 |
| 0.7909722222222223 | 56.398 |
| 0.7916666666666666 | 56.398 |
| 0.7923611111111111 | 56.398 |
| 0.7930555555555556 | 60.85 |
| 0.7937500000000001 | 60.85 |
| 0.7944444444444444 | 60.85 |
| 0.7951388888888888 | 65.31 |
| 0.7958333333333334 | 60.85 |
| 0.7965277777777778 | 60.85 |
| 0.7972222222222222 | 60.85 |
| 0.7979166666666666 | 60.85 |
| 0.7986111111111112 | 56.398 |
| 0.7993055555555556 | 56.398 |
| 0.7999999999999999 | 56.398 |
| 0.8006944444444444 | 51.951 |
| 0.8013888888888889 | 51.951 |
| 0.8020833333333334 | 51.951 |
| 0.8027777777777777 | 51.951 |
| 0.8034722222222223 | 51.951 |
| 0.8041666666666667 | 51.951 |
| 0.8048611111111111 | 51.951 |
| 0.8055555555555555 | 56.398 |
| 0.80625 | 56.398 |
| 0.8069444444444445 | 56.398 |
| 0.8076388888888889 | 56.398 |
| 0.8083333333333332 | 56.398 |
| 0.8090277777777778 | 56.398 |
| 0.8097222222222222 | 51.951 |
| 0.8104166666666667 | 51.951 |
| 0.811111111111111 | 47.511 |
| 0.8118055555555556 | 47.511 |
| 0.8125 | 43.079 |
| 0.8131944444444444 | 43.079 |
| 0.813888888888889 | 38.653 |
| 0.8145833333333333 | 38.653 |
| 0.8152777777777778 | 38.653 |
| 0.8159722222222222 | 34.234 |
| 0.8166666666666668 | 29.823 |
| 0.8173611111111111 | 29.823 |
| 0.8180555555555555 | 25.419 |
| 0.81875 | 21.024 |
| 0.8194444444444445 | 21.024 |
| 0.8201388888888889 | 16.636 |
| 0.8208333333333333 | 16.636 |
| 0.8215277777777777 | 12.257 |
| 0.8222222222222223 | 12.257 |
| 0.8229166666666666 | 12.257 |
| 0.8236111111111111 | 7.887 |
| 0.8243055555555556 | 7.887 |
| 0.8250000000000001 | 7.887 |
| 0.8256944444444444 | 7.887 |
| 0.8263888888888888 | 3.525 |
| 0.8270833333333334 | 3.525 |
| 0.8277777777777778 | 3.525 |
| 0.8284722222222222 | 3.525 |
| 0.8291666666666666 | 3.525 |
| 0.8298611111111112 | 3.525 |
| 0.8305555555555556 | 3.525 |
| 0.8312499999999999 | 3.525 |
| 0.8319444444444444 | 3.525 |
| 0.8326388888888889 | 0 |
| 0.8333333333333334 | 0 |
| 0.8340277777777777 | 0 |
| 0.8347222222222223 | 0 |
| 0.8354166666666667 | 0 |
| 0.8361111111111111 | 0 |
| 0.8368055555555555 | 0 |
| 0.8375 | 0 |
| 0.8381944444444445 | 0 |
| 0.8388888888888889 | 0 |
| 0.8395833333333332 | 0 |
| 0.8402777777777778 | 0 |
| 0.8409722222222222 | 0 |
| 0.8416666666666667 | 0 |
| 0.842361111111111 | 0 |
| 0.8430555555555556 | 0 |
| 0.84375 | 0 |
| 0.8444444444444444 | 0 |
| 0.845138888888889 | 0 |
| 0.8458333333333333 | 0 |
| 0.8465277777777778 | 0 |
| 0.8472222222222222 | 0 |
| 0.8479166666666668 | 0 |
| 0.8486111111111111 | 0 |
| 0.8493055555555555 | 0 |
| 0.85 | 0 |
| 0.8506944444444445 | 0 |
| 0.8513888888888889 | 0 |
| 0.8520833333333333 | 0 |
| 0.8527777777777777 | 0 |
| 0.8534722222222223 | 0 |
| 0.8541666666666666 | 0 |
| 0.8548611111111111 | 0 |
| 0.8555555555555556 | 0 |
| 0.8562500000000001 | 0 |
| 0.8569444444444444 | 0 |
| 0.8576388888888888 | 0 |
| 0.8583333333333334 | 0 |
| 0.8590277777777778 | 0 |
| 0.8597222222222222 | 0 |
| 0.8604166666666666 | 0 |
| 0.8611111111111112 | 0 |
| 0.8618055555555556 | 0 |
| 0.8624999999999999 | 0 |
| 0.8631944444444444 | 0 |
| 0.8638888888888889 | 0 |
| 0.8645833333333334 | 0 |
| 0.8652777777777777 | 0 |
| 0.8659722222222223 | 0 |
| 0.8666666666666667 | 0 |
| 0.8673611111111111 | 0 |
| 0.8680555555555555 | 0 |
| 0.86875 | 0 |
| 0.8694444444444445 | 0 |
| 0.8701388888888889 | 0 |
| 0.8708333333333332 | 0 |
| 0.8715277777777778 | 0 |
| 0.8722222222222222 | 0 |
| 0.8729166666666667 | 0 |
| 0.873611111111111 | 0 |
| 0.8743055555555556 | 0 |
| 0.875 | 0 |
| 0.8756944444444444 | 0 |
| 0.876388888888889 | 0 |
| 0.8770833333333333 | 0 |
| 0.8777777777777778 | 0 |
| 0.8784722222222222 | 0 |
| 0.8791666666666668 | 0 |
| 0.8798611111111111 | 0 |
| 0.8805555555555555 | 0 |
| 0.88125 | 0 |
| 0.8819444444444445 | 0 |
| 0.8826388888888889 | 0 |
| 0.8833333333333333 | 0 |
| 0.8840277777777777 | 0 |
| 0.8847222222222223 | 0 |
| 0.8854166666666666 | 0 |
| 0.8861111111111111 | 0 |
| 0.8868055555555556 | 0 |
| 0.8875000000000001 | 0 |
| 0.8881944444444444 | 0 |
| 0.8888888888888888 | 0 |
| 0.8895833333333334 | 0 |
| 0.8902777777777778 | 0 |
| 0.8909722222222222 | 0 |
| 0.8916666666666666 | 0 |
| 0.8923611111111112 | 0 |
| 0.8930555555555556 | 0 |
| 0.8937499999999999 | 0 |
| 0.8944444444444444 | 0 |
| 0.8951388888888889 | 0 |
| 0.8958333333333334 | 0 |
| 0.8965277777777777 | 0 |
| 0.8972222222222223 | 0 |
| 0.8979166666666667 | 0 |
| 0.8986111111111111 | 0 |
| 0.8993055555555555 | 0 |
| 0.9 | 0 |
| 0.9006944444444445 | 0 |
| 0.9013888888888889 | 0 |
| 0.9020833333333332 | 0 |
| 0.9027777777777778 | 0 |
| 0.9034722222222222 | 0 |
| 0.9041666666666667 | 0 |
| 0.904861111111111 | 0 |
| 0.9055555555555556 | 0 |
| 0.90625 | 0 |
| 0.9069444444444444 | 0 |
| 0.907638888888889 | 0 |
| 0.9083333333333333 | 0 |
| 0.9090277777777778 | 0 |
| 0.9097222222222222 | 0 |
| 0.9104166666666668 | 0 |
| 0.9111111111111111 | 0 |
| 0.9118055555555555 | 0 |
| 0.9125 | 0 |
| 0.9131944444444445 | 0 |
| 0.9138888888888889 | 0 |
| 0.9145833333333333 | 0 |
| 0.9152777777777777 | 0 |
| 0.9159722222222223 | 0 |
| 0.9166666666666666 | 0 |
| 0.9173611111111111 | 0 |
| 0.9180555555555556 | 0 |
| 0.9187500000000001 | 0 |
| 0.9194444444444444 | 0 |
| 0.9201388888888888 | 0 |
| 0.9208333333333334 | 0 |
| 0.9215277777777778 | 0 |
| 0.9222222222222222 | 0 |
| 0.9229166666666666 | 0 |
| 0.9236111111111112 | 0 |
| 0.9243055555555556 | 0 |
| 0.9249999999999999 | 0 |
| 0.9256944444444444 | 0 |
| 0.9263888888888889 | 0 |
| 0.9270833333333334 | 0 |
| 0.9277777777777777 | 0 |
| 0.9284722222222223 | 0 |
| 0.9291666666666667 | 0 |
| 0.9298611111111111 | 0 |
| 0.9305555555555555 | 0 |
| 0.93125 | 0 |
| 0.9319444444444445 | 0 |
| 0.9326388888888889 | 0 |
| 0.9333333333333332 | 0 |
| 0.9340277777777778 | 0 |
| 0.9347222222222222 | 0 |
| 0.9354166666666667 | 0 |
| 0.936111111111111 | 0 |
| 0.9368055555555556 | 0 |
| 0.9375 | 0 |
| 0.9381944444444444 | 0 |
| 0.938888888888889 | 0 |
| 0.9395833333333333 | 0 |
| 0.9402777777777778 | 0 |
| 0.9409722222222222 | 0 |
| 0.9416666666666668 | 0 |
| 0.9423611111111111 | 0 |
| 0.9430555555555555 | 0 |
| 0.94375 | 0 |
| 0.9444444444444445 | 0 |
| 0.9451388888888889 | 0 |
| 0.9458333333333333 | 0 |
| 0.9465277777777777 | 0 |
| 0.9472222222222223 | 0 |
| 0.9479166666666666 | 0 |
| 0.9486111111111111 | 0 |
| 0.9493055555555556 | 0 |
| 0.9500000000000001 | 0 |
| 0.9506944444444444 | 0 |
| 0.9513888888888888 | 0 |
| 0.9520833333333334 | 0 |
| 0.9527777777777778 | 0 |
| 0.9534722222222222 | 0 |
| 0.9541666666666666 | 0 |
| 0.9548611111111112 | 0 |
| 0.9555555555555556 | 0 |
| 0.9562499999999999 | 0 |
| 0.9569444444444444 | 0 |
| 0.9576388888888889 | 0 |
| 0.9583333333333334 | 0 |
| 0.9590277777777777 | 0 |
| 0.9597222222222223 | 0 |
| 0.9604166666666667 | 0 |
| 0.9611111111111111 | 0 |
| 0.9618055555555555 | 0 |
| 0.9625 | 0 |
| 0.9631944444444445 | 0 |
| 0.9638888888888889 | 0 |
| 0.9645833333333332 | 0 |
| 0.9652777777777778 | 0 |
| 0.9659722222222222 | 0 |
| 0.9666666666666667 | 0 |
| 0.967361111111111 | 0 |
| 0.9680555555555556 | 0 |
| 0.96875 | 0 |
| 0.9694444444444444 | 0 |
| 0.970138888888889 | 0 |
| 0.9708333333333333 | 0 |
| 0.9715277777777778 | 0 |
| 0.9722222222222222 | 0 |
| 0.9729166666666668 | 0 |
| 0.9736111111111111 | 0 |
| 0.9743055555555555 | 0 |
| 0.975 | 0 |
| 0.9756944444444445 | 0 |
| 0.9763888888888889 | 0 |
| 0.9770833333333333 | 0 |
| 0.9777777777777777 | 0 |
| 0.9784722222222223 | 0 |
| 0.9791666666666666 | 0 |
| 0.9798611111111111 | 0 |
| 0.9805555555555556 | 0 |
| 0.9812500000000001 | 0 |
| 0.9819444444444444 | 0 |
| 0.9826388888888888 | 0 |
| 0.9833333333333334 | 0 |
| 0.9840277777777778 | 0 |
| 0.9847222222222222 | 0 |
| 0.9854166666666666 | 0 |
| 0.9861111111111112 | 0 |
| 0.9868055555555556 | 0 |
| 0.9874999999999999 | 0 |
| 0.9881944444444444 | 0 |
| 0.9888888888888889 | 0 |
| 0.9895833333333334 | 0 |
| 0.9902777777777777 | 0 |
| 0.9909722222222223 | 0 |
| 0.9916666666666667 | 0 |
| 0.9923611111111111 | 0 |
| 0.9930555555555555 | 0 |
| 0.99375 | 0 |
| 0.9944444444444445 | 0 |
| 0.9951388888888889 | 0 |
| 0.9958333333333332 | 0 |
| 0.9965277777777778 | 0 |
| 0.9972222222222222 | 0 |
| 0.9979166666666667 | 0 |
| 0.998611111111111 | 0 |
| 0.9993055555555556 | 0 |